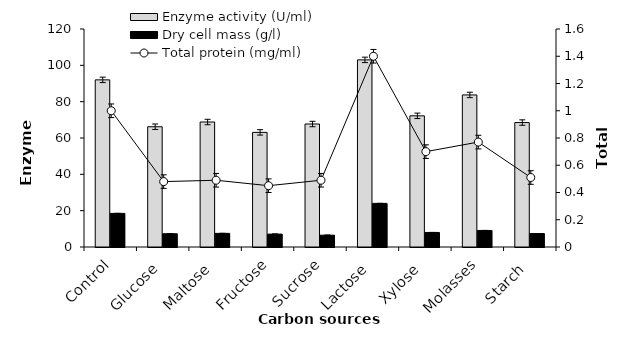
| Category | Enzyme activity (U/ml) | Dry cell mass (g/l) |
|---|---|---|
| Control | 92 | 18.5 |
| Glucose | 66.2 | 7.3 |
| Maltose | 68.8 | 7.5 |
| Fructose | 63.1 | 7.1 |
| Sucrose | 67.7 | 6.5 |
| Lactose | 103 | 24 |
| Xylose | 72.2 | 8 |
| Molasses | 83.7 | 9.1 |
| Starch | 68.5 | 7.4 |